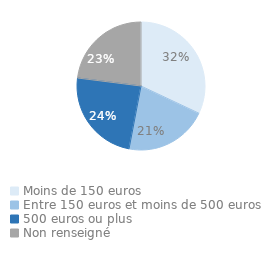
| Category | Series 0 |
|---|---|
| Moins de 150 euros | 0.32 |
| Entre 150 euros et moins de 500 euros | 0.21 |
| 500 euros ou plus | 0.24 |
| Non renseigné | 0.23 |